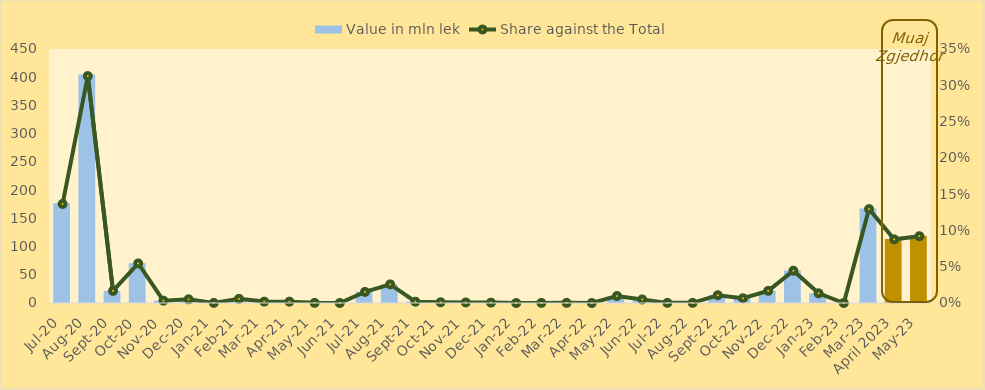
| Category | Value in mln lek |
|---|---|
| Jul-20 | 176.8 |
| Aug-20 | 405 |
| Sep-20 | 21.6 |
| Oct-20 | 70.65 |
| Nov-20 | 4.2 |
| Dec-20 | 6.55 |
| Jan-21 | 0.25 |
| Feb-21 | 7.4 |
| Mar-21 | 2.5 |
| Apr-21 | 2.45 |
| May-21 | 0.25 |
| Jun-21 | 0 |
| Jul-21 | 19.8 |
| Aug-21 | 33.2 |
| Sep-21 | 2.3 |
| Oct-21 | 1.3 |
| Nov-21 | 1 |
| Dec-21 | 0.7 |
| Jan-22 | 0 |
| Feb-22 | 0.2 |
| Mar-22 | 0.25 |
| Apr-22 | 0 |
| May-22 | 12.484 |
| Jun-22 | 6.307 |
| Jul-22 | 0.25 |
| Aug-22 | 0.25 |
| Sep-22 | 13.89 |
| Oct-22 | 8.44 |
| Nov-22 | 21.731 |
| Dec-22 | 57.589 |
| Jan-23 | 17.325 |
| Feb-23 | 0 |
| Mar-23 | 167.612 |
| April 2023 | 113.595 |
| May-23 | 119.218 |